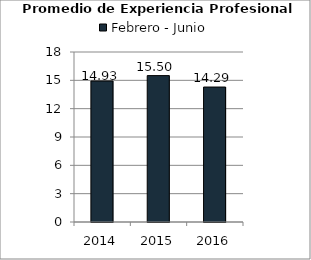
| Category | Febrero - Junio |
|---|---|
| 2014.0 | 14.93 |
| 2015.0 | 15.5 |
| 2016.0 | 14.29 |